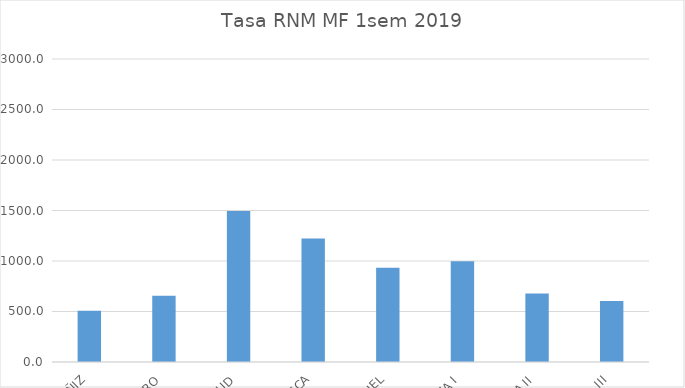
| Category | 1sem 2019 |
|---|---|
| ALCAÑIZ | 506.367 |
| BARBASTRO | 656.49 |
| CALATAYUD | 1494.039 |
| HUESCA | 1221.579 |
| TERUEL | 932.678 |
| ZARAGOZA I | 996.786 |
| ZARAGOZA II | 677.288 |
| ZARAGOZA III | 602.86 |